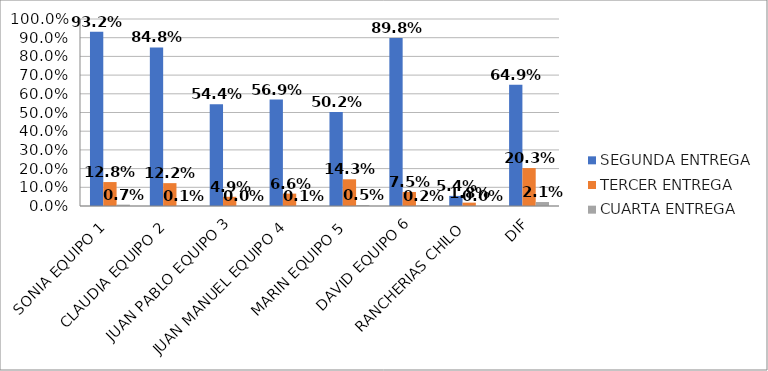
| Category | SEGUNDA ENTREGA | TERCER ENTREGA | CUARTA ENTREGA |
|---|---|---|---|
| SONIA EQUIPO 1 | 0.932 | 0.128 | 0.007 |
| CLAUDIA EQUIPO 2 | 0.848 | 0.122 | 0.001 |
| JUAN PABLO EQUIPO 3 | 0.544 | 0.049 | 0 |
| JUAN MANUEL EQUIPO 4 | 0.569 | 0.066 | 0.001 |
| MARIN EQUIPO 5 | 0.502 | 0.143 | 0.005 |
| DAVID EQUIPO 6 | 0.898 | 0.075 | 0.002 |
| RANCHERIAS CHILO | 0.054 | 0.018 | 0 |
| DIF | 0.649 | 0.203 | 0.021 |